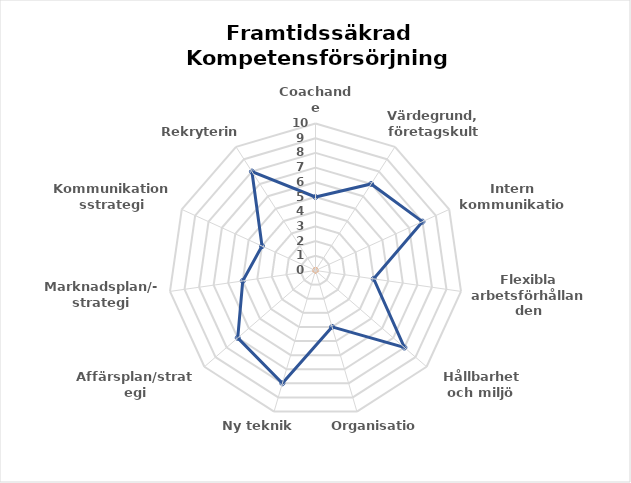
| Category | Series 0 | Series 1 |
|---|---|---|
| Coachande ledarskap | 5 |  |
| Värdegrund, företagskultur | 7 |  |
| Intern kommunikation  | 8 |  |
| Flexibla arbetsförhållanden | 4 |  |
| Hållbarhet och miljö  | 8 |  |
| Organisation | 4 |  |
| Ny teknik  | 8 |  |
| Affärsplan/strategi | 7 |  |
| Marknadsplan/-strategi | 5 |  |
| Kommunikationsstrategi (externt) | 4 |  |
| Rekrytering | 8 |  |